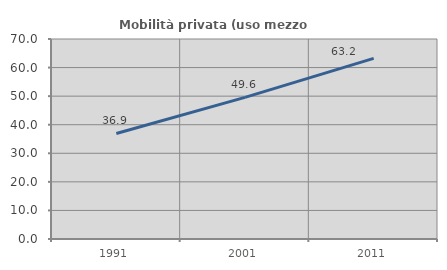
| Category | Mobilità privata (uso mezzo privato) |
|---|---|
| 1991.0 | 36.936 |
| 2001.0 | 49.561 |
| 2011.0 | 63.232 |